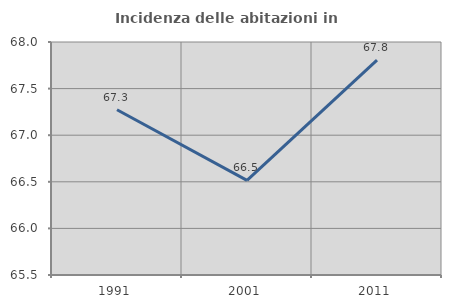
| Category | Incidenza delle abitazioni in proprietà  |
|---|---|
| 1991.0 | 67.273 |
| 2001.0 | 66.516 |
| 2011.0 | 67.805 |